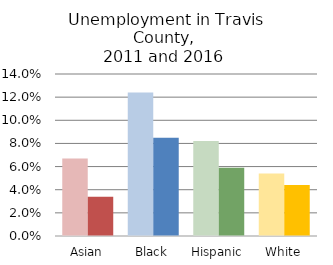
| Category | Series 0 | Series 1 |
|---|---|---|
| Asian | 0.067 | 0.034 |
| Black | 0.124 | 0.085 |
| Hispanic | 0.082 | 0.059 |
| White | 0.054 | 0.044 |